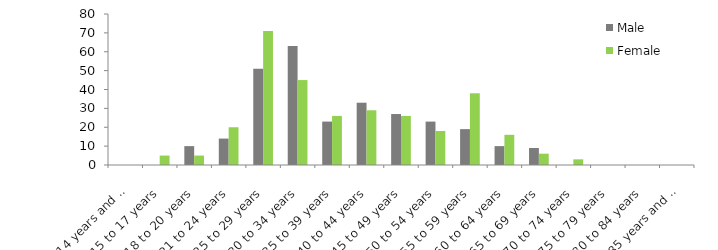
| Category | Male | Female |
|---|---|---|
| 14 years and under | 0 | 0 |
| 15 to 17 years | 0 | 5 |
| 18 to 20 years | 10 | 5 |
| 21 to 24 years | 14 | 20 |
| 25 to 29 years | 51 | 71 |
| 30 to 34 years | 63 | 45 |
| 35 to 39 years | 23 | 26 |
| 40 to 44 years | 33 | 29 |
| 45 to 49 years | 27 | 26 |
| 50 to 54 years | 23 | 18 |
| 55 to 59 years | 19 | 38 |
| 60 to 64 years | 10 | 16 |
| 65 to 69 years | 9 | 6 |
| 70 to 74 years | 0 | 3 |
| 75 to 79 years | 0 | 0 |
| 80 to 84 years | 0 | 0 |
| 85 years and over | 0 | 0 |